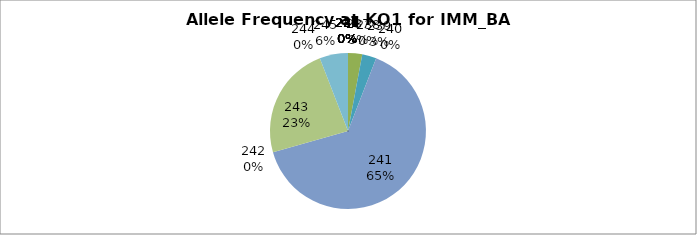
| Category | Series 0 |
|---|---|
| 221.0 | 0 |
| 227.0 | 0 |
| 231.0 | 0 |
| 232.0 | 0 |
| 233.0 | 0 |
| 234.0 | 0 |
| 235.0 | 0 |
| 236.0 | 0 |
| 237.0 | 0.029 |
| 238.0 | 0 |
| 239.0 | 0.029 |
| 240.0 | 0 |
| 241.0 | 0.647 |
| 242.0 | 0 |
| 243.0 | 0.235 |
| 244.0 | 0 |
| 245.0 | 0.059 |
| 247.0 | 0 |
| 249.0 | 0 |